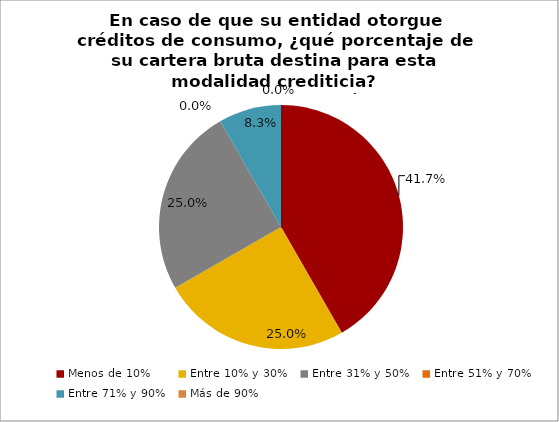
| Category | En caso de que su entidad otorgue créditos de consumo, ¿qué porcentaje de su cartera bruta destina para esta modalidad crediticia? Mercado de microcrédito |
|---|---|
| Menos de 10% | 0.417 |
| Entre 10% y 30% | 0.25 |
| Entre 31% y 50% | 0.25 |
| Entre 51% y 70% | 0 |
| Entre 71% y 90% | 0.083 |
| Más de 90% | 0 |